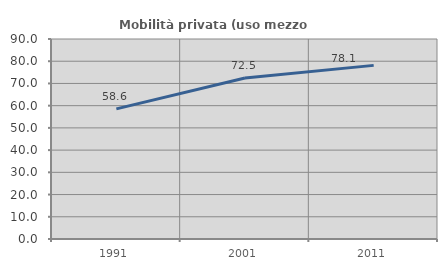
| Category | Mobilità privata (uso mezzo privato) |
|---|---|
| 1991.0 | 58.562 |
| 2001.0 | 72.484 |
| 2011.0 | 78.129 |